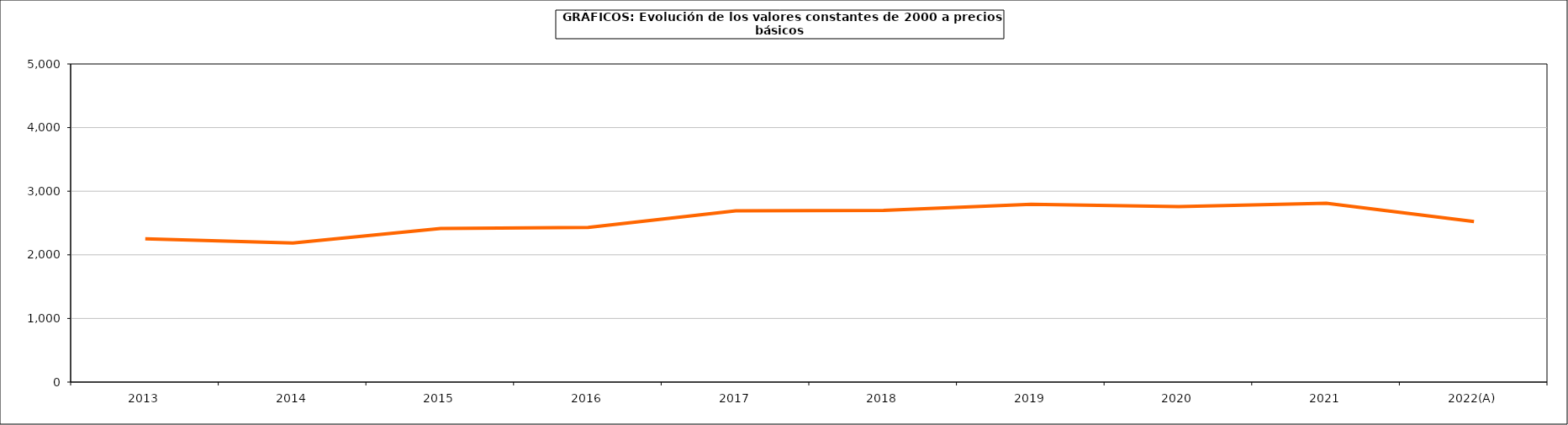
| Category | Formación bruta del capital fijo |
|---|---|
| 2013 | 2253.363 |
| 2014 | 2184.558 |
| 2015 | 2413.291 |
| 2016 | 2429.162 |
| 2017 | 2691.407 |
| 2018 | 2699.572 |
| 2019 | 2793.638 |
| 2020 | 2758.59 |
| 2021 | 2809.458 |
| 2022(A) | 2523.714 |